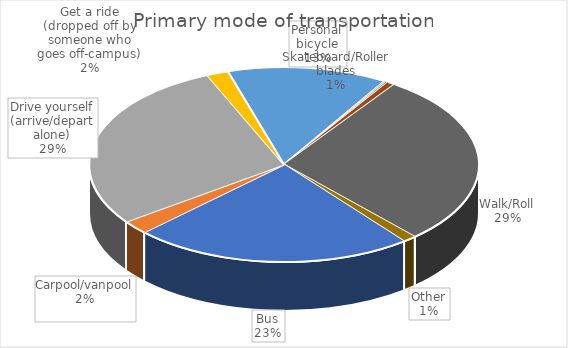
| Category | Series 0 | Series 1 |
|---|---|---|
| Bus | 142 | 0.233 |
| Carpool/vanpool | 14 | 0.023 |
| Drive yourself (arrive/depart alone) | 174 | 0.285 |
| Get a ride (dropped off by someone who goes off-campus) | 11 | 0.018 |
| Personal bicycle | 81 | 0.133 |
| Ride share (Uber/Lyft) | 1 | 0.002 |
| Scooter | 1 | 0.002 |
| Skateboard/Roller blades | 4 | 0.007 |
| Walk/Roll | 175 | 0.287 |
| Other | 7 | 0.011 |